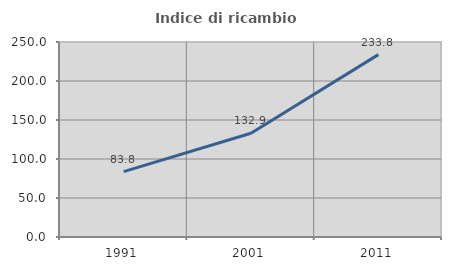
| Category | Indice di ricambio occupazionale  |
|---|---|
| 1991.0 | 83.764 |
| 2001.0 | 132.941 |
| 2011.0 | 233.835 |